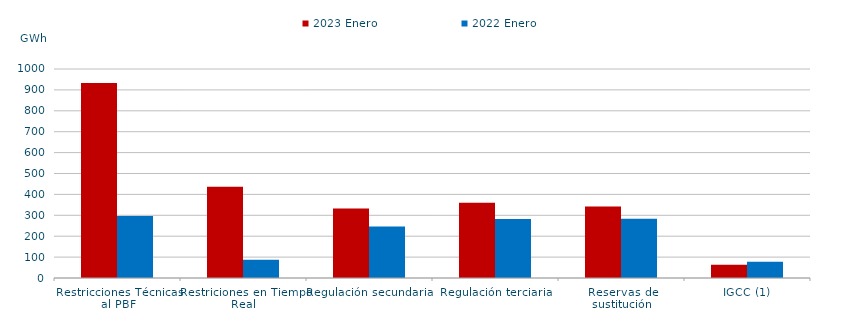
| Category | 2023 Enero | 2022 Enero |
|---|---|---|
| Restricciones Técnicas al PBF | 933.346 | 297.102 |
| Restriciones en Tiempo Real | 436.885 | 87.59 |
| Regulación secundaria | 332.701 | 246.271 |
| Regulación terciaria | 359.927 | 281.907 |
| Reservas de sustitución | 341.675 | 283.971 |
| IGCC (1) | 63.422 | 77.925 |